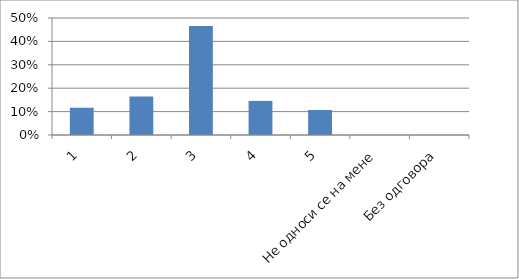
| Category | Series 0 |
|---|---|
| 1 | 0.117 |
| 2 | 0.165 |
| 3 | 0.466 |
| 4 | 0.146 |
| 5 | 0.107 |
| Не односи се на мене | 0 |
| Без одговора | 0 |